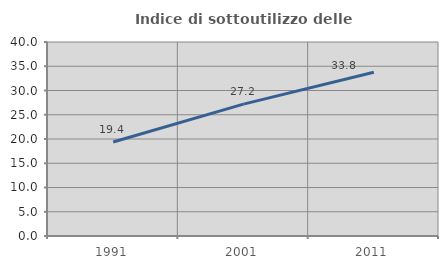
| Category | Indice di sottoutilizzo delle abitazioni  |
|---|---|
| 1991.0 | 19.379 |
| 2001.0 | 27.186 |
| 2011.0 | 33.764 |